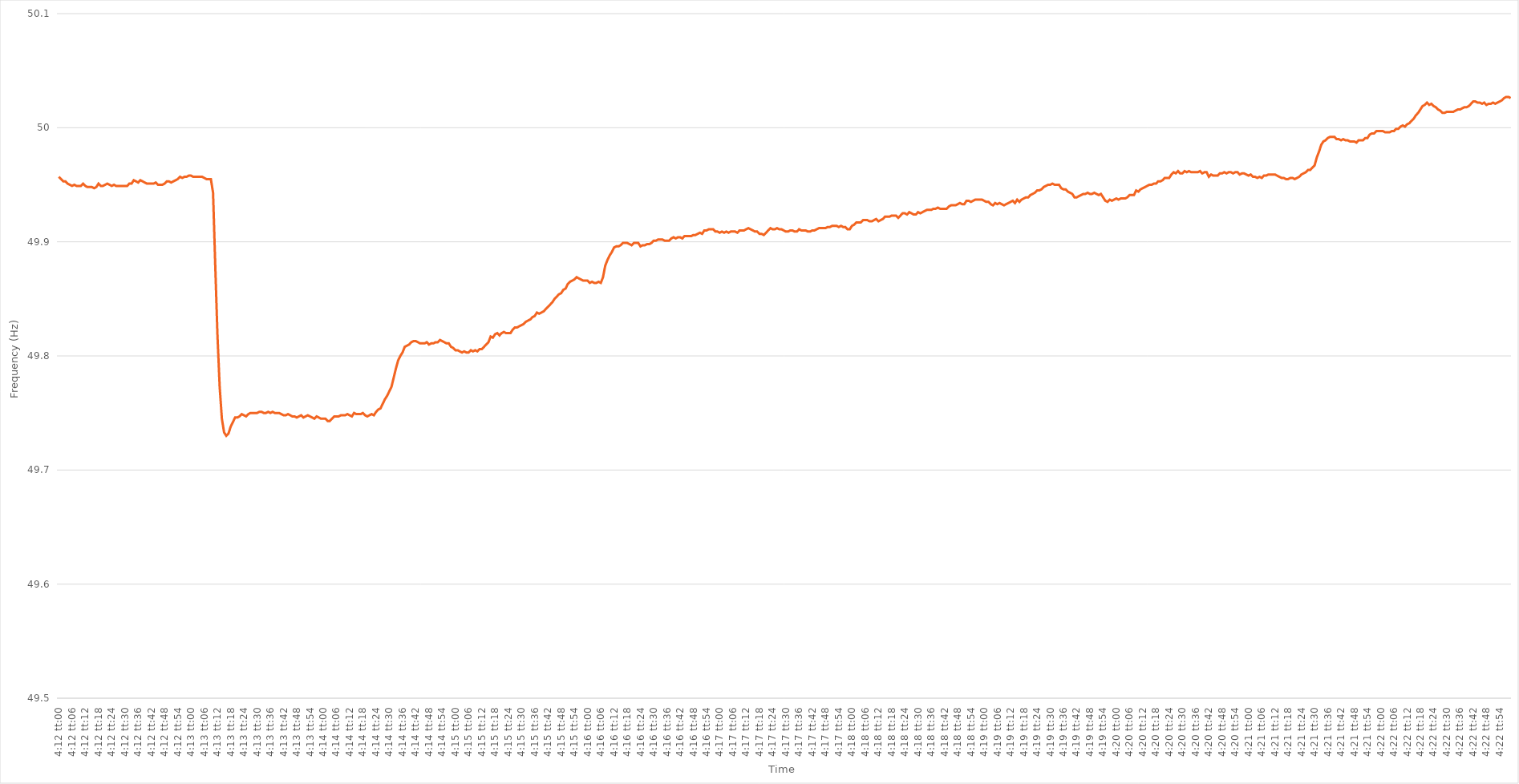
| Category | Series 0 |
|---|---|
| 0.17500000000000002 | 49.957 |
| 0.17501157407407408 | 49.955 |
| 0.17502314814814815 | 49.953 |
| 0.17503472222222224 | 49.953 |
| 0.1750462962962963 | 49.951 |
| 0.17505787037037038 | 49.95 |
| 0.17506944444444442 | 49.949 |
| 0.1750810185185185 | 49.95 |
| 0.17509259259259258 | 49.949 |
| 0.17510416666666664 | 49.949 |
| 0.17511574074074074 | 49.949 |
| 0.1751273148148148 | 49.951 |
| 0.17513888888888887 | 49.949 |
| 0.17515046296296297 | 49.948 |
| 0.17516203703703703 | 49.948 |
| 0.1751736111111111 | 49.948 |
| 0.1751851851851852 | 49.947 |
| 0.17519675925925926 | 49.948 |
| 0.17520833333333333 | 49.951 |
| 0.17521990740740742 | 49.949 |
| 0.1752314814814815 | 49.949 |
| 0.17524305555555555 | 49.95 |
| 0.17525462962962965 | 49.951 |
| 0.17526620370370372 | 49.95 |
| 0.17527777777777778 | 49.949 |
| 0.17528935185185188 | 49.95 |
| 0.17530092592592594 | 49.949 |
| 0.17531249999999998 | 49.949 |
| 0.17532407407407405 | 49.949 |
| 0.17533564814814814 | 49.949 |
| 0.1753472222222222 | 49.949 |
| 0.17535879629629628 | 49.949 |
| 0.17537037037037037 | 49.951 |
| 0.17538194444444444 | 49.951 |
| 0.1753935185185185 | 49.954 |
| 0.1754050925925926 | 49.953 |
| 0.17541666666666667 | 49.952 |
| 0.17542824074074073 | 49.954 |
| 0.17543981481481483 | 49.953 |
| 0.1754513888888889 | 49.952 |
| 0.17546296296296296 | 49.951 |
| 0.17547453703703705 | 49.951 |
| 0.17548611111111112 | 49.951 |
| 0.1754976851851852 | 49.951 |
| 0.17550925925925928 | 49.952 |
| 0.17552083333333335 | 49.95 |
| 0.17553240740740741 | 49.95 |
| 0.1755439814814815 | 49.95 |
| 0.17555555555555555 | 49.951 |
| 0.17556712962962961 | 49.953 |
| 0.17557870370370368 | 49.953 |
| 0.17559027777777778 | 49.952 |
| 0.17560185185185184 | 49.953 |
| 0.1756134259259259 | 49.954 |
| 0.175625 | 49.955 |
| 0.17563657407407407 | 49.957 |
| 0.17564814814814814 | 49.956 |
| 0.17565972222222223 | 49.957 |
| 0.1756712962962963 | 49.957 |
| 0.17568287037037036 | 49.958 |
| 0.17569444444444446 | 49.958 |
| 0.17570601851851853 | 49.957 |
| 0.1757175925925926 | 49.957 |
| 0.1757291666666667 | 49.957 |
| 0.17574074074074075 | 49.957 |
| 0.17575231481481482 | 49.957 |
| 0.17576388888888891 | 49.956 |
| 0.17577546296296298 | 49.955 |
| 0.17578703703703702 | 49.955 |
| 0.17579861111111109 | 49.955 |
| 0.17581018518518518 | 49.943 |
| 0.17582175925925925 | 49.879 |
| 0.1758333333333333 | 49.818 |
| 0.1758449074074074 | 49.773 |
| 0.17585648148148147 | 49.745 |
| 0.17586805555555554 | 49.733 |
| 0.17587962962962964 | 49.73 |
| 0.1758912037037037 | 49.732 |
| 0.17590277777777777 | 49.738 |
| 0.17591435185185186 | 49.742 |
| 0.17592592592592593 | 49.746 |
| 0.1759375 | 49.746 |
| 0.1759490740740741 | 49.747 |
| 0.17596064814814816 | 49.749 |
| 0.17597222222222222 | 49.748 |
| 0.17598379629629632 | 49.747 |
| 0.17599537037037039 | 49.749 |
| 0.17600694444444445 | 49.75 |
| 0.1760185185185185 | 49.75 |
| 0.17603009259259259 | 49.75 |
| 0.17604166666666665 | 49.75 |
| 0.17605324074074072 | 49.751 |
| 0.1760648148148148 | 49.751 |
| 0.17607638888888888 | 49.75 |
| 0.17608796296296295 | 49.75 |
| 0.17609953703703704 | 49.751 |
| 0.1761111111111111 | 49.75 |
| 0.17612268518518517 | 49.751 |
| 0.17613425925925927 | 49.75 |
| 0.17614583333333333 | 49.75 |
| 0.1761574074074074 | 49.75 |
| 0.1761689814814815 | 49.749 |
| 0.17618055555555556 | 49.748 |
| 0.17619212962962963 | 49.748 |
| 0.17620370370370372 | 49.749 |
| 0.1762152777777778 | 49.748 |
| 0.17622685185185186 | 49.747 |
| 0.17623842592592595 | 49.747 |
| 0.17625000000000002 | 49.746 |
| 0.17626157407407406 | 49.747 |
| 0.17627314814814812 | 49.748 |
| 0.17628472222222222 | 49.746 |
| 0.17629629629629628 | 49.747 |
| 0.17630787037037035 | 49.748 |
| 0.17631944444444445 | 49.747 |
| 0.1763310185185185 | 49.746 |
| 0.17634259259259258 | 49.745 |
| 0.17635416666666667 | 49.747 |
| 0.17636574074074074 | 49.746 |
| 0.1763773148148148 | 49.745 |
| 0.1763888888888889 | 49.745 |
| 0.17640046296296297 | 49.745 |
| 0.17641203703703703 | 49.743 |
| 0.17642361111111113 | 49.743 |
| 0.1764351851851852 | 49.745 |
| 0.17644675925925926 | 49.747 |
| 0.17645833333333336 | 49.747 |
| 0.17646990740740742 | 49.747 |
| 0.1764814814814815 | 49.748 |
| 0.17649305555555558 | 49.748 |
| 0.17650462962962962 | 49.748 |
| 0.1765162037037037 | 49.749 |
| 0.17652777777777776 | 49.748 |
| 0.17653935185185185 | 49.747 |
| 0.17655092592592592 | 49.75 |
| 0.17656249999999998 | 49.749 |
| 0.17657407407407408 | 49.749 |
| 0.17658564814814814 | 49.749 |
| 0.1765972222222222 | 49.75 |
| 0.1766087962962963 | 49.748 |
| 0.17662037037037037 | 49.747 |
| 0.17663194444444444 | 49.748 |
| 0.17664351851851853 | 49.749 |
| 0.1766550925925926 | 49.748 |
| 0.17666666666666667 | 49.751 |
| 0.17667824074074076 | 49.753 |
| 0.17668981481481483 | 49.754 |
| 0.1767013888888889 | 49.758 |
| 0.176712962962963 | 49.762 |
| 0.17672453703703703 | 49.765 |
| 0.1767361111111111 | 49.769 |
| 0.17674768518518516 | 49.773 |
| 0.17675925925925925 | 49.781 |
| 0.17677083333333332 | 49.789 |
| 0.1767824074074074 | 49.796 |
| 0.17679398148148148 | 49.8 |
| 0.17680555555555555 | 49.803 |
| 0.17681712962962962 | 49.808 |
| 0.1768287037037037 | 49.809 |
| 0.17684027777777778 | 49.81 |
| 0.17685185185185184 | 49.812 |
| 0.17686342592592594 | 49.813 |
| 0.176875 | 49.813 |
| 0.17688657407407407 | 49.812 |
| 0.17689814814814817 | 49.811 |
| 0.17690972222222223 | 49.811 |
| 0.1769212962962963 | 49.811 |
| 0.1769328703703704 | 49.812 |
| 0.17694444444444446 | 49.81 |
| 0.17695601851851853 | 49.811 |
| 0.17696759259259257 | 49.811 |
| 0.17697916666666666 | 49.812 |
| 0.17699074074074073 | 49.812 |
| 0.1770023148148148 | 49.814 |
| 0.1770138888888889 | 49.813 |
| 0.17702546296296295 | 49.812 |
| 0.17703703703703702 | 49.811 |
| 0.17704861111111111 | 49.811 |
| 0.17706018518518518 | 49.808 |
| 0.17707175925925925 | 49.807 |
| 0.17708333333333334 | 49.805 |
| 0.1770949074074074 | 49.805 |
| 0.17710648148148148 | 49.804 |
| 0.17711805555555557 | 49.803 |
| 0.17712962962962964 | 49.804 |
| 0.1771412037037037 | 49.803 |
| 0.1771527777777778 | 49.803 |
| 0.17716435185185186 | 49.805 |
| 0.17717592592592593 | 49.804 |
| 0.17718750000000003 | 49.805 |
| 0.1771990740740741 | 49.804 |
| 0.17721064814814813 | 49.806 |
| 0.1772222222222222 | 49.806 |
| 0.1772337962962963 | 49.808 |
| 0.17724537037037036 | 49.81 |
| 0.17725694444444443 | 49.812 |
| 0.17726851851851852 | 49.817 |
| 0.1772800925925926 | 49.816 |
| 0.17729166666666665 | 49.819 |
| 0.17730324074074075 | 49.82 |
| 0.17731481481481481 | 49.818 |
| 0.17732638888888888 | 49.82 |
| 0.17733796296296298 | 49.821 |
| 0.17734953703703704 | 49.82 |
| 0.1773611111111111 | 49.82 |
| 0.1773726851851852 | 49.82 |
| 0.17738425925925927 | 49.823 |
| 0.17739583333333334 | 49.825 |
| 0.17740740740740743 | 49.825 |
| 0.1774189814814815 | 49.826 |
| 0.17743055555555556 | 49.827 |
| 0.17744212962962966 | 49.828 |
| 0.1774537037037037 | 49.83 |
| 0.17746527777777776 | 49.831 |
| 0.17747685185185183 | 49.832 |
| 0.17748842592592592 | 49.834 |
| 0.1775 | 49.835 |
| 0.17751157407407406 | 49.838 |
| 0.17752314814814815 | 49.837 |
| 0.17753472222222222 | 49.838 |
| 0.17754629629629629 | 49.839 |
| 0.17755787037037038 | 49.841 |
| 0.17756944444444445 | 49.843 |
| 0.1775810185185185 | 49.845 |
| 0.1775925925925926 | 49.847 |
| 0.17760416666666667 | 49.85 |
| 0.17761574074074074 | 49.852 |
| 0.17762731481481484 | 49.854 |
| 0.1776388888888889 | 49.855 |
| 0.17765046296296297 | 49.858 |
| 0.17766203703703706 | 49.859 |
| 0.1776736111111111 | 49.863 |
| 0.17768518518518517 | 49.865 |
| 0.17769675925925923 | 49.866 |
| 0.17770833333333333 | 49.867 |
| 0.1777199074074074 | 49.869 |
| 0.17773148148148146 | 49.868 |
| 0.17774305555555556 | 49.867 |
| 0.17775462962962962 | 49.866 |
| 0.1777662037037037 | 49.866 |
| 0.17777777777777778 | 49.866 |
| 0.17778935185185185 | 49.864 |
| 0.17780092592592592 | 49.865 |
| 0.1778125 | 49.864 |
| 0.17782407407407408 | 49.864 |
| 0.17783564814814815 | 49.865 |
| 0.17784722222222224 | 49.864 |
| 0.1778587962962963 | 49.869 |
| 0.17787037037037037 | 49.879 |
| 0.17788194444444447 | 49.884 |
| 0.17789351851851853 | 49.888 |
| 0.1779050925925926 | 49.891 |
| 0.17791666666666664 | 49.895 |
| 0.17792824074074073 | 49.896 |
| 0.1779398148148148 | 49.896 |
| 0.17795138888888887 | 49.897 |
| 0.17796296296296296 | 49.899 |
| 0.17797453703703703 | 49.899 |
| 0.1779861111111111 | 49.899 |
| 0.1779976851851852 | 49.898 |
| 0.17800925925925926 | 49.897 |
| 0.17802083333333332 | 49.899 |
| 0.17803240740740742 | 49.899 |
| 0.17804398148148148 | 49.899 |
| 0.17805555555555555 | 49.896 |
| 0.17806712962962964 | 49.897 |
| 0.1780787037037037 | 49.897 |
| 0.17809027777777778 | 49.898 |
| 0.17810185185185187 | 49.898 |
| 0.17811342592592594 | 49.899 |
| 0.178125 | 49.901 |
| 0.1781365740740741 | 49.901 |
| 0.17814814814814817 | 49.902 |
| 0.1781597222222222 | 49.902 |
| 0.17817129629629627 | 49.902 |
| 0.17818287037037037 | 49.901 |
| 0.17819444444444443 | 49.901 |
| 0.1782060185185185 | 49.901 |
| 0.1782175925925926 | 49.903 |
| 0.17822916666666666 | 49.904 |
| 0.17824074074074073 | 49.903 |
| 0.17825231481481482 | 49.904 |
| 0.1782638888888889 | 49.904 |
| 0.17827546296296296 | 49.903 |
| 0.17828703703703705 | 49.905 |
| 0.17829861111111112 | 49.905 |
| 0.17831018518518518 | 49.905 |
| 0.17832175925925928 | 49.905 |
| 0.17833333333333334 | 49.906 |
| 0.1783449074074074 | 49.906 |
| 0.1783564814814815 | 49.907 |
| 0.17836805555555557 | 49.908 |
| 0.17837962962962964 | 49.907 |
| 0.17839120370370368 | 49.91 |
| 0.17840277777777777 | 49.91 |
| 0.17841435185185184 | 49.911 |
| 0.1784259259259259 | 49.911 |
| 0.1784375 | 49.911 |
| 0.17844907407407407 | 49.909 |
| 0.17846064814814813 | 49.909 |
| 0.17847222222222223 | 49.908 |
| 0.1784837962962963 | 49.909 |
| 0.17849537037037036 | 49.908 |
| 0.17850694444444445 | 49.909 |
| 0.17851851851851852 | 49.908 |
| 0.1785300925925926 | 49.909 |
| 0.17854166666666668 | 49.909 |
| 0.17855324074074075 | 49.909 |
| 0.17856481481481482 | 49.908 |
| 0.1785763888888889 | 49.91 |
| 0.17858796296296298 | 49.91 |
| 0.17859953703703704 | 49.91 |
| 0.17861111111111114 | 49.911 |
| 0.17862268518518518 | 49.912 |
| 0.17863425925925924 | 49.911 |
| 0.1786458333333333 | 49.91 |
| 0.1786574074074074 | 49.909 |
| 0.17866898148148147 | 49.909 |
| 0.17868055555555554 | 49.907 |
| 0.17869212962962963 | 49.907 |
| 0.1787037037037037 | 49.906 |
| 0.17871527777777776 | 49.908 |
| 0.17872685185185186 | 49.91 |
| 0.17873842592592593 | 49.912 |
| 0.17875 | 49.911 |
| 0.1787615740740741 | 49.911 |
| 0.17877314814814815 | 49.912 |
| 0.17878472222222222 | 49.911 |
| 0.17879629629629631 | 49.911 |
| 0.17880787037037038 | 49.91 |
| 0.17881944444444445 | 49.909 |
| 0.17883101851851854 | 49.909 |
| 0.1788425925925926 | 49.91 |
| 0.17885416666666668 | 49.91 |
| 0.17886574074074071 | 49.909 |
| 0.1788773148148148 | 49.909 |
| 0.17888888888888888 | 49.911 |
| 0.17890046296296294 | 49.91 |
| 0.17891203703703704 | 49.91 |
| 0.1789236111111111 | 49.91 |
| 0.17893518518518517 | 49.909 |
| 0.17894675925925926 | 49.909 |
| 0.17895833333333333 | 49.91 |
| 0.1789699074074074 | 49.91 |
| 0.1789814814814815 | 49.911 |
| 0.17899305555555556 | 49.912 |
| 0.17900462962962962 | 49.912 |
| 0.17901620370370372 | 49.912 |
| 0.17902777777777779 | 49.912 |
| 0.17903935185185185 | 49.913 |
| 0.17905092592592595 | 49.913 |
| 0.1790625 | 49.914 |
| 0.17907407407407408 | 49.914 |
| 0.17908564814814817 | 49.914 |
| 0.1790972222222222 | 49.913 |
| 0.17910879629629628 | 49.914 |
| 0.17912037037037035 | 49.913 |
| 0.17913194444444444 | 49.913 |
| 0.1791435185185185 | 49.911 |
| 0.17915509259259257 | 49.911 |
| 0.17916666666666667 | 49.914 |
| 0.17917824074074074 | 49.915 |
| 0.1791898148148148 | 49.917 |
| 0.1792013888888889 | 49.917 |
| 0.17921296296296296 | 49.917 |
| 0.17922453703703703 | 49.919 |
| 0.17923611111111112 | 49.919 |
| 0.1792476851851852 | 49.919 |
| 0.17925925925925926 | 49.918 |
| 0.17927083333333335 | 49.918 |
| 0.17928240740740742 | 49.919 |
| 0.17929398148148148 | 49.92 |
| 0.17930555555555558 | 49.918 |
| 0.17931712962962965 | 49.919 |
| 0.1793287037037037 | 49.92 |
| 0.17934027777777775 | 49.922 |
| 0.17935185185185185 | 49.922 |
| 0.1793634259259259 | 49.922 |
| 0.17937499999999998 | 49.923 |
| 0.17938657407407407 | 49.923 |
| 0.17939814814814814 | 49.923 |
| 0.1794097222222222 | 49.921 |
| 0.1794212962962963 | 49.923 |
| 0.17943287037037037 | 49.925 |
| 0.17944444444444443 | 49.925 |
| 0.17945601851851853 | 49.924 |
| 0.1794675925925926 | 49.926 |
| 0.17947916666666666 | 49.925 |
| 0.17949074074074076 | 49.924 |
| 0.17950231481481482 | 49.924 |
| 0.1795138888888889 | 49.926 |
| 0.17952546296296298 | 49.925 |
| 0.17953703703703705 | 49.926 |
| 0.17954861111111112 | 49.927 |
| 0.1795601851851852 | 49.928 |
| 0.17957175925925925 | 49.928 |
| 0.17958333333333332 | 49.928 |
| 0.17959490740740738 | 49.929 |
| 0.17960648148148148 | 49.929 |
| 0.17961805555555554 | 49.93 |
| 0.1796296296296296 | 49.929 |
| 0.1796412037037037 | 49.929 |
| 0.17965277777777777 | 49.929 |
| 0.17966435185185184 | 49.929 |
| 0.17967592592592593 | 49.931 |
| 0.1796875 | 49.932 |
| 0.17969907407407407 | 49.932 |
| 0.17971064814814816 | 49.932 |
| 0.17972222222222223 | 49.933 |
| 0.1797337962962963 | 49.934 |
| 0.1797453703703704 | 49.933 |
| 0.17975694444444446 | 49.933 |
| 0.17976851851851852 | 49.936 |
| 0.17978009259259262 | 49.936 |
| 0.17979166666666668 | 49.935 |
| 0.17980324074074075 | 49.936 |
| 0.1798148148148148 | 49.937 |
| 0.17982638888888888 | 49.937 |
| 0.17983796296296295 | 49.937 |
| 0.17984953703703702 | 49.937 |
| 0.1798611111111111 | 49.936 |
| 0.17987268518518518 | 49.935 |
| 0.17988425925925924 | 49.935 |
| 0.17989583333333334 | 49.933 |
| 0.1799074074074074 | 49.932 |
| 0.17991898148148147 | 49.934 |
| 0.17993055555555557 | 49.933 |
| 0.17994212962962963 | 49.934 |
| 0.1799537037037037 | 49.933 |
| 0.1799652777777778 | 49.932 |
| 0.17997685185185186 | 49.933 |
| 0.17998842592592593 | 49.934 |
| 0.18000000000000002 | 49.935 |
| 0.1800115740740741 | 49.936 |
| 0.18002314814814815 | 49.934 |
| 0.18003472222222225 | 49.937 |
| 0.1800462962962963 | 49.935 |
| 0.18005787037037035 | 49.937 |
| 0.18006944444444442 | 49.938 |
| 0.18008101851851852 | 49.939 |
| 0.18009259259259258 | 49.939 |
| 0.18010416666666665 | 49.941 |
| 0.18011574074074074 | 49.942 |
| 0.1801273148148148 | 49.943 |
| 0.18013888888888888 | 49.945 |
| 0.18015046296296297 | 49.945 |
| 0.18016203703703704 | 49.946 |
| 0.1801736111111111 | 49.948 |
| 0.1801851851851852 | 49.949 |
| 0.18019675925925926 | 49.95 |
| 0.18020833333333333 | 49.95 |
| 0.18021990740740743 | 49.951 |
| 0.1802314814814815 | 49.95 |
| 0.18024305555555556 | 49.95 |
| 0.18025462962962965 | 49.95 |
| 0.18026620370370372 | 49.947 |
| 0.1802777777777778 | 49.946 |
| 0.18028935185185183 | 49.946 |
| 0.18030092592592592 | 49.944 |
| 0.1803125 | 49.943 |
| 0.18032407407407405 | 49.942 |
| 0.18033564814814815 | 49.939 |
| 0.18034722222222221 | 49.939 |
| 0.18035879629629628 | 49.94 |
| 0.18037037037037038 | 49.941 |
| 0.18038194444444444 | 49.942 |
| 0.1803935185185185 | 49.942 |
| 0.1804050925925926 | 49.943 |
| 0.18041666666666667 | 49.942 |
| 0.18042824074074074 | 49.942 |
| 0.18043981481481483 | 49.943 |
| 0.1804513888888889 | 49.942 |
| 0.18046296296296296 | 49.941 |
| 0.18047453703703706 | 49.942 |
| 0.18048611111111112 | 49.939 |
| 0.1804976851851852 | 49.936 |
| 0.18050925925925929 | 49.935 |
| 0.18052083333333332 | 49.937 |
| 0.1805324074074074 | 49.936 |
| 0.18054398148148146 | 49.937 |
| 0.18055555555555555 | 49.938 |
| 0.18056712962962962 | 49.937 |
| 0.18057870370370369 | 49.938 |
| 0.18059027777777778 | 49.938 |
| 0.18060185185185185 | 49.938 |
| 0.1806134259259259 | 49.939 |
| 0.180625 | 49.941 |
| 0.18063657407407407 | 49.941 |
| 0.18064814814814814 | 49.941 |
| 0.18065972222222224 | 49.945 |
| 0.1806712962962963 | 49.944 |
| 0.18068287037037037 | 49.946 |
| 0.18069444444444446 | 49.947 |
| 0.18070601851851853 | 49.948 |
| 0.1807175925925926 | 49.949 |
| 0.1807291666666667 | 49.95 |
| 0.18074074074074076 | 49.95 |
| 0.18075231481481482 | 49.951 |
| 0.18076388888888886 | 49.951 |
| 0.18077546296296296 | 49.953 |
| 0.18078703703703702 | 49.953 |
| 0.1807986111111111 | 49.954 |
| 0.18081018518518518 | 49.956 |
| 0.18082175925925925 | 49.956 |
| 0.18083333333333332 | 49.956 |
| 0.1808449074074074 | 49.959 |
| 0.18085648148148148 | 49.961 |
| 0.18086805555555555 | 49.96 |
| 0.18087962962962964 | 49.962 |
| 0.1808912037037037 | 49.96 |
| 0.18090277777777777 | 49.96 |
| 0.18091435185185187 | 49.962 |
| 0.18092592592592593 | 49.961 |
| 0.1809375 | 49.962 |
| 0.1809490740740741 | 49.961 |
| 0.18096064814814816 | 49.961 |
| 0.18097222222222223 | 49.961 |
| 0.18098379629629632 | 49.961 |
| 0.18099537037037036 | 49.962 |
| 0.18100694444444443 | 49.96 |
| 0.1810185185185185 | 49.961 |
| 0.1810300925925926 | 49.961 |
| 0.18104166666666666 | 49.957 |
| 0.18105324074074072 | 49.959 |
| 0.18106481481481482 | 49.958 |
| 0.18107638888888888 | 49.958 |
| 0.18108796296296295 | 49.958 |
| 0.18109953703703704 | 49.96 |
| 0.1811111111111111 | 49.96 |
| 0.18112268518518518 | 49.961 |
| 0.18113425925925927 | 49.96 |
| 0.18114583333333334 | 49.961 |
| 0.1811574074074074 | 49.961 |
| 0.1811689814814815 | 49.96 |
| 0.18118055555555557 | 49.961 |
| 0.18119212962962963 | 49.961 |
| 0.18120370370370373 | 49.959 |
| 0.1812152777777778 | 49.96 |
| 0.18122685185185183 | 49.96 |
| 0.1812384259259259 | 49.959 |
| 0.18125 | 49.958 |
| 0.18126157407407406 | 49.959 |
| 0.18127314814814813 | 49.957 |
| 0.18128472222222222 | 49.957 |
| 0.1812962962962963 | 49.956 |
| 0.18130787037037036 | 49.957 |
| 0.18131944444444445 | 49.956 |
| 0.18133101851851852 | 49.958 |
| 0.18134259259259258 | 49.958 |
| 0.18135416666666668 | 49.959 |
| 0.18136574074074074 | 49.959 |
| 0.1813773148148148 | 49.959 |
| 0.1813888888888889 | 49.959 |
| 0.18140046296296297 | 49.958 |
| 0.18141203703703704 | 49.957 |
| 0.18142361111111113 | 49.956 |
| 0.1814351851851852 | 49.956 |
| 0.18144675925925927 | 49.955 |
| 0.18145833333333336 | 49.955 |
| 0.1814699074074074 | 49.956 |
| 0.18148148148148147 | 49.956 |
| 0.18149305555555553 | 49.955 |
| 0.18150462962962963 | 49.956 |
| 0.1815162037037037 | 49.957 |
| 0.18152777777777776 | 49.959 |
| 0.18153935185185185 | 49.96 |
| 0.18155092592592592 | 49.961 |
| 0.1815625 | 49.963 |
| 0.18157407407407408 | 49.963 |
| 0.18158564814814815 | 49.965 |
| 0.18159722222222222 | 49.967 |
| 0.1816087962962963 | 49.974 |
| 0.18162037037037038 | 49.979 |
| 0.18163194444444444 | 49.985 |
| 0.18164351851851854 | 49.988 |
| 0.1816550925925926 | 49.989 |
| 0.18166666666666667 | 49.991 |
| 0.18167824074074077 | 49.992 |
| 0.18168981481481483 | 49.992 |
| 0.18170138888888887 | 49.992 |
| 0.18171296296296294 | 49.99 |
| 0.18172453703703703 | 49.99 |
| 0.1817361111111111 | 49.989 |
| 0.18174768518518516 | 49.99 |
| 0.18175925925925926 | 49.989 |
| 0.18177083333333333 | 49.989 |
| 0.1817824074074074 | 49.988 |
| 0.1817939814814815 | 49.988 |
| 0.18180555555555555 | 49.988 |
| 0.18181712962962962 | 49.987 |
| 0.18182870370370371 | 49.989 |
| 0.18184027777777778 | 49.989 |
| 0.18185185185185185 | 49.989 |
| 0.18186342592592594 | 49.991 |
| 0.181875 | 49.991 |
| 0.18188657407407408 | 49.994 |
| 0.18189814814814817 | 49.995 |
| 0.18190972222222224 | 49.995 |
| 0.1819212962962963 | 49.997 |
| 0.1819328703703704 | 49.997 |
| 0.18194444444444444 | 49.997 |
| 0.1819560185185185 | 49.997 |
| 0.18196759259259257 | 49.996 |
| 0.18197916666666666 | 49.996 |
| 0.18199074074074073 | 49.996 |
| 0.1820023148148148 | 49.997 |
| 0.1820138888888889 | 49.997 |
| 0.18202546296296296 | 49.999 |
| 0.18203703703703702 | 49.999 |
| 0.18204861111111112 | 50.001 |
| 0.18206018518518519 | 50.002 |
| 0.18207175925925925 | 50.001 |
| 0.18208333333333335 | 50.003 |
| 0.1820949074074074 | 50.004 |
| 0.18210648148148148 | 50.006 |
| 0.18211805555555557 | 50.008 |
| 0.18212962962962964 | 50.011 |
| 0.1821412037037037 | 50.013 |
| 0.1821527777777778 | 50.016 |
| 0.18216435185185187 | 50.019 |
| 0.1821759259259259 | 50.02 |
| 0.18218749999999997 | 50.022 |
| 0.18219907407407407 | 50.02 |
| 0.18221064814814814 | 50.021 |
| 0.1822222222222222 | 50.019 |
| 0.1822337962962963 | 50.018 |
| 0.18224537037037036 | 50.016 |
| 0.18225694444444443 | 50.015 |
| 0.18226851851851852 | 50.013 |
| 0.1822800925925926 | 50.013 |
| 0.18229166666666666 | 50.014 |
| 0.18230324074074075 | 50.014 |
| 0.18231481481481482 | 50.014 |
| 0.18232638888888889 | 50.014 |
| 0.18233796296296298 | 50.015 |
| 0.18234953703703705 | 50.016 |
| 0.1823611111111111 | 50.016 |
| 0.1823726851851852 | 50.017 |
| 0.18238425925925927 | 50.018 |
| 0.18239583333333334 | 50.018 |
| 0.18240740740740743 | 50.019 |
| 0.18241898148148147 | 50.021 |
| 0.18243055555555554 | 50.023 |
| 0.1824421296296296 | 50.023 |
| 0.1824537037037037 | 50.022 |
| 0.18246527777777777 | 50.022 |
| 0.18247685185185183 | 50.021 |
| 0.18248842592592593 | 50.022 |
| 0.1825 | 50.02 |
| 0.18251157407407406 | 50.021 |
| 0.18252314814814816 | 50.021 |
| 0.18253472222222222 | 50.022 |
| 0.1825462962962963 | 50.021 |
| 0.18255787037037038 | 50.022 |
| 0.18256944444444445 | 50.023 |
| 0.18258101851851852 | 50.024 |
| 0.1825925925925926 | 50.026 |
| 0.18260416666666668 | 50.027 |
| 0.18261574074074075 | 50.027 |
| 0.18262731481481484 | 50.026 |